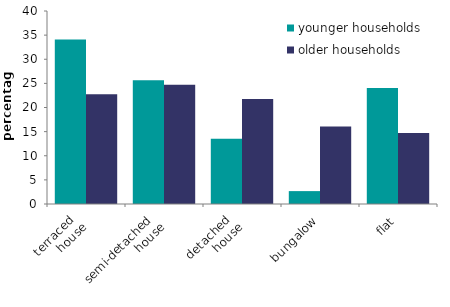
| Category | younger households | older households |
|---|---|---|
| terraced 
house | 34.095 | 22.748 |
| semi-detached 
house | 25.644 | 24.699 |
| detached 
house | 13.531 | 21.771 |
| bungalow | 2.672 | 16.061 |
| flat | 24.058 | 14.722 |